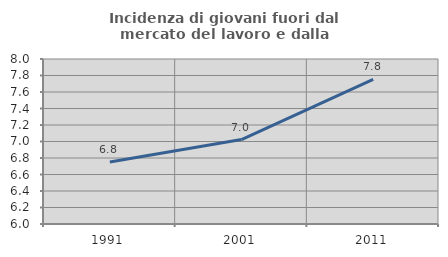
| Category | Incidenza di giovani fuori dal mercato del lavoro e dalla formazione  |
|---|---|
| 1991.0 | 6.752 |
| 2001.0 | 7.023 |
| 2011.0 | 7.753 |